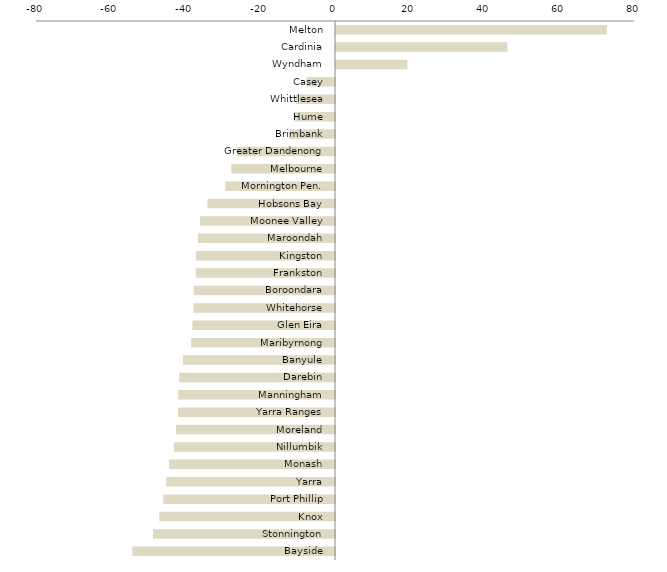
| Category | Series 0 |
|---|---|
| Melton | 72.475 |
| Cardinia | 45.868 |
| Wyndham | 19.094 |
| Casey | -7.569 |
| Whittlesea | -10.426 |
| Hume | -10.912 |
| Brimbank | -12.3 |
| Greater Dandenong | -26.318 |
| Melbourne | -27.746 |
| Mornington Pen. | -29.349 |
| Hobsons Bay | -34.136 |
| Moonee Valley | -36.118 |
| Maroondah | -36.708 |
| Kingston | -37.213 |
| Frankston | -37.251 |
| Boroondara | -37.786 |
| Whitehorse | -37.871 |
| Glen Eira | -38.158 |
| Maribyrnong | -38.476 |
| Banyule | -40.681 |
| Darebin | -41.696 |
| Manningham | -41.951 |
| Yarra Ranges | -41.972 |
| Moreland | -42.546 |
| Nillumbik | -43.117 |
| Monash | -44.391 |
| Yarra | -45.154 |
| Port Phillip | -45.97 |
| Knox | -47.006 |
| Stonnington | -48.699 |
| Bayside | -54.215 |